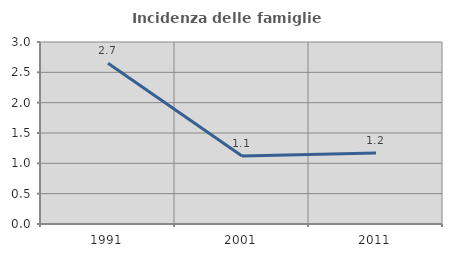
| Category | Incidenza delle famiglie numerose |
|---|---|
| 1991.0 | 2.65 |
| 2001.0 | 1.121 |
| 2011.0 | 1.169 |